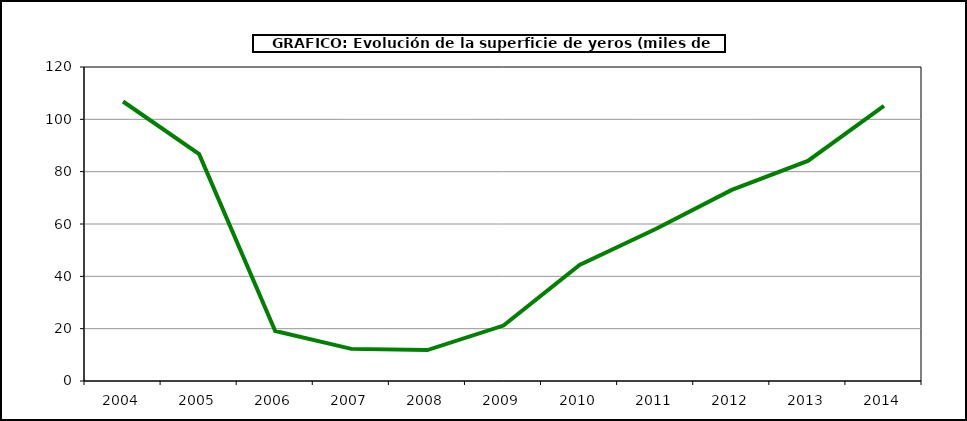
| Category | Superficie |
|---|---|
| 2004.0 | 106.812 |
| 2005.0 | 86.685 |
| 2006.0 | 19.105 |
| 2007.0 | 12.276 |
| 2008.0 | 11.807 |
| 2009.0 | 21.198 |
| 2010.0 | 44.369 |
| 2011.0 | 58.104 |
| 2012.0 | 73.051 |
| 2013.0 | 84.103 |
| 2014.0 | 105.185 |